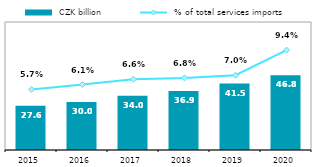
| Category |  CZK billion |
|---|---|
| 2015.0 | 27.615 |
| 2016.0 | 30.003 |
| 2017.0 | 33.956 |
| 2018.0 | 36.888 |
| 2019.0 | 41.504 |
| 2020.0 | 46.796 |